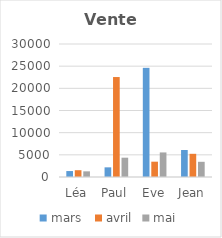
| Category | mars  | avril | mai |
|---|---|---|---|
| Léa | 1342 | 1534 | 1276 |
| Paul | 2178 | 22548 | 4354 |
| Eve | 24622 | 3455 | 5542 |
| Jean | 6087 | 5231 | 3428 |